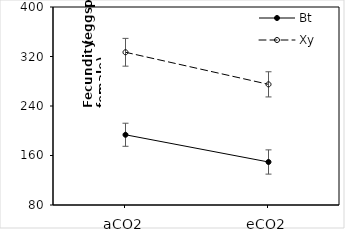
| Category | Bt | Xy |
|---|---|---|
| aCO2 | 193.5 | 326.833 |
| eCO2 | 149.5 | 275 |